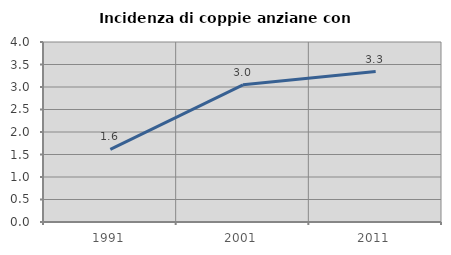
| Category | Incidenza di coppie anziane con figli |
|---|---|
| 1991.0 | 1.614 |
| 2001.0 | 3.049 |
| 2011.0 | 3.344 |